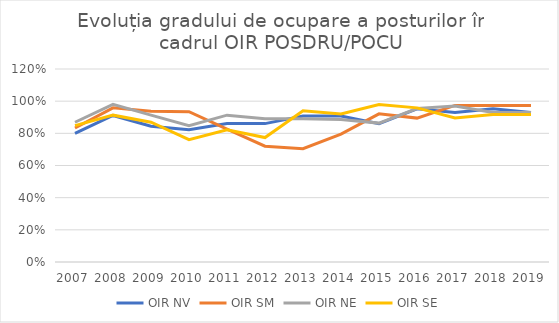
| Category | OIR NV | OIR SM | OIR NE | OIR SE |
|---|---|---|---|---|
| 2007.0 | 0.8 | 0.833 | 0.869 | 0.848 |
| 2008.0 | 0.911 | 0.958 | 0.98 | 0.913 |
| 2009.0 | 0.844 | 0.938 | 0.913 | 0.87 |
| 2010.0 | 0.822 | 0.935 | 0.848 | 0.761 |
| 2011.0 | 0.86 | 0.826 | 0.913 | 0.822 |
| 2012.0 | 0.86 | 0.72 | 0.891 | 0.774 |
| 2013.0 | 0.907 | 0.704 | 0.891 | 0.94 |
| 2014.0 | 0.907 | 0.796 | 0.886 | 0.92 |
| 2015.0 | 0.86 | 0.921 | 0.864 | 0.979 |
| 2016.0 | 0.952 | 0.895 | 0.954 | 0.958 |
| 2017.0 | 0.93 | 0.974 | 0.97 | 0.896 |
| 2018.0 | 0.954 | 0.974 | 0.93 | 0.917 |
| 2019.0 | 0.93 | 0.974 | 0.93 | 0.917 |